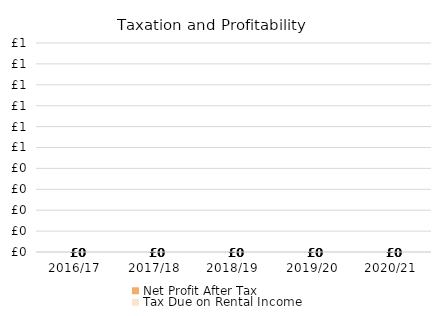
| Category | Net Profit After Tax | Tax Due on Rental Income |
|---|---|---|
| 2016/17 | 0 | 0 |
| 2017/18 | 0 | 0 |
| 2018/19 | 0 | 0 |
| 2019/20 | 0 | 0 |
| 2020/21 | 0 | 0 |